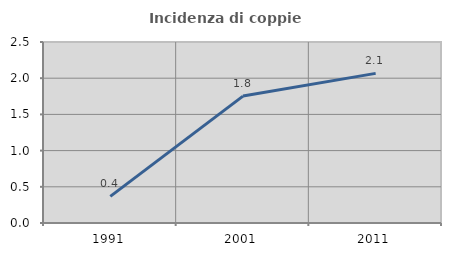
| Category | Incidenza di coppie miste |
|---|---|
| 1991.0 | 0.367 |
| 2001.0 | 1.753 |
| 2011.0 | 2.067 |